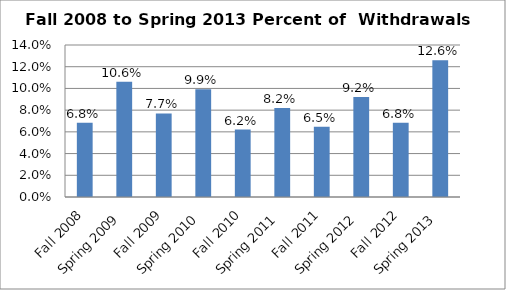
| Category | PercentWithdrawals |
|---|---|
| Fall 2008 | 0.068 |
| Spring 2009 | 0.106 |
| Fall 2009 | 0.077 |
| Spring 2010 | 0.099 |
| Fall 2010 | 0.062 |
| Spring 2011 | 0.082 |
| Fall 2011 | 0.065 |
| Spring 2012 | 0.092 |
| Fall 2012 | 0.068 |
| Spring 2013 | 0.126 |